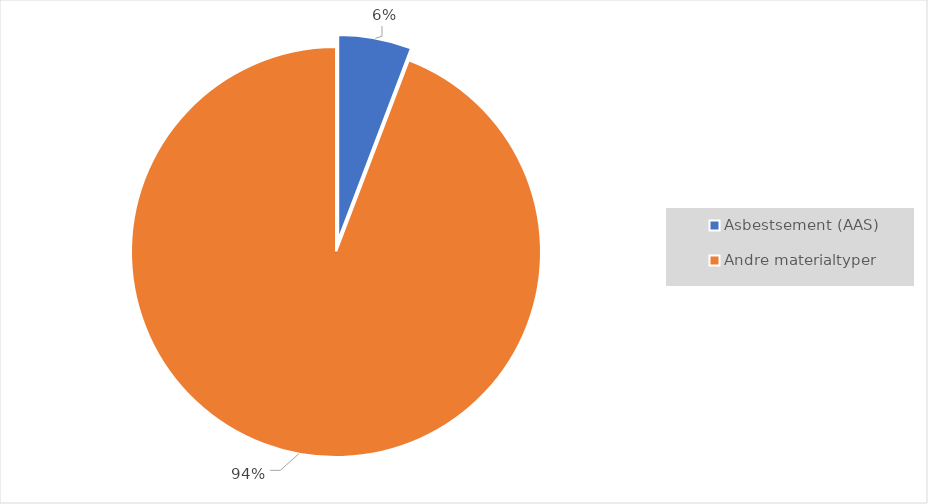
| Category | Series 0 |
|---|---|
| Asbestsement (AAS) | 0.058 |
| Andre materialtyper | 0.942 |